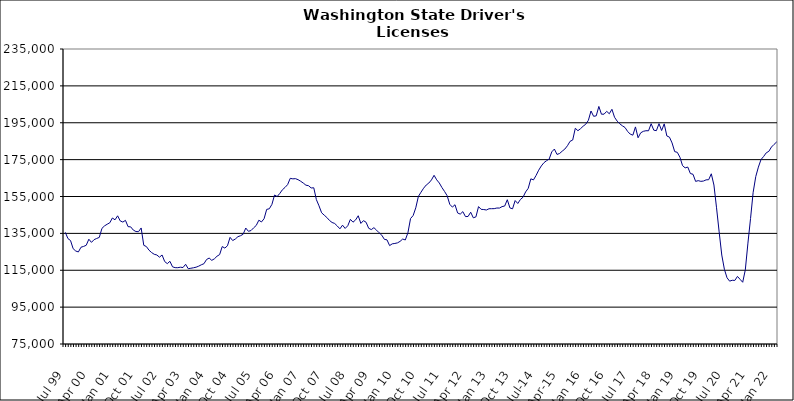
| Category | Series 0 |
|---|---|
| Jul 99 | 135560 |
| Aug 99 | 132182 |
| Sep 99 | 131104 |
| Oct 99 | 126694 |
| Nov 99 | 125425 |
| Dec 99 | 124927 |
| Jan 00 | 127499 |
| Feb 00 | 127927 |
| Mar 00 | 128547 |
| Apr 00 | 131834 |
| May 00 | 130120 |
| Jun 00 | 131595 |
| Jul 00 | 132236 |
| Aug 00 | 132819 |
| Sep 00 | 137711 |
| Oct 00 | 139063 |
| Nov 00 | 139952 |
| Dec 00 | 140732 |
| Jan 01 | 143338 |
| Feb 01 | 142359 |
| Mar 01 | 144523 |
| Apr 01 | 141758 |
| May 01 | 141135 |
| Jun 01 | 142064 |
| Jul 01 | 138646 |
| Aug 01 | 138530 |
| Sep 01 | 136784 |
| Oct 01 | 135996 |
| Nov 01 | 135917 |
| Dec 01 | 137940 |
| Jan 02 | 128531 |
| Feb 02 | 127848 |
| Mar 02 | 125876 |
| Apr 02 | 124595 |
| May 02 | 123660 |
| Jun 02 | 123282 |
| Jul 02 | 122089 |
| Aug 02 | 123279 |
| Sep 02 | 119727 |
| Oct 02 | 118588 |
| Nov 02 | 119854 |
| Dec 02 | 116851 |
| Jan 03 | 116407 |
| Feb 03 | 116382 |
| Mar 03 | 116648 |
| Apr 03 | 116471 |
| May 03 | 118231 |
| Jun 03 | 115831 |
| Jul 03 | 116082 |
| Aug 03 | 116341 |
| Sep 03 | 116653 |
| Oct 03 | 117212 |
| Nov 03 | 117962 |
| Dec 03 | 118542 |
| Jan 04 | 120817 |
| Feb 04 | 121617 |
| Mar 04 | 120369 |
| Apr 04 | 121200 |
| May 04 | 122609 |
| Jun 04 | 123484 |
| Jul 04 | 127844 |
| Aug 04 | 127025 |
| Sep 04 | 128273 |
| Oct 04 | 132853 |
| Nov 04 | 131106 |
| Dec 04 | 131935 |
| Jan 05 | 133205 |
| Feb 05 | 133736 |
| Mar 05 | 134528 |
| Apr 05 | 137889 |
| May 05 | 136130 |
| Jun 05 | 136523 |
| Jul 05 | 137997 |
| Aug 05 | 139294 |
| Sep 05 | 142140 |
| Oct 05 | 141192 |
| Nov 05 | 142937 |
| Dec 05 | 148013 |
| Jan 06 | 148341 |
| Feb 06 | 150744 |
| Mar 06 | 155794 |
| Apr 06 | 154984 |
| May 06 | 156651 |
| Jun 06 | 158638 |
| Jul 06 | 159911 |
| Aug 06 | 161445 |
| Sep 06 | 164852 |
| Oct 06 | 164570 |
| Nov 06 | 164679 |
| Dec 06 | 164127 |
| Jan 07 | 163271 |
| Feb 07 | 162273 |
| Mar 07 | 161140 |
| Apr 07 | 160860 |
| May 07 | 159633 |
| Jun 07 | 159724 |
| Jul 07 | 153303 |
| Aug 07 | 149939 |
| Sep 07 | 146172 |
| Oct 07 | 144876 |
| Nov 07 | 143613 |
| Dec 07 | 142022 |
| Jan 08 | 140909 |
| Feb 08 | 140368 |
| Mar 08 | 138998 |
| Apr 08 | 137471 |
| May 08 | 139453 |
| Jun 08 | 137680 |
| Jul 08 | 139120 |
| Aug 08 | 142612 |
| Sep-08 | 141071 |
| Oct 08 | 142313 |
| Nov 08 | 144556 |
| Dec 08 | 140394 |
| Jan 09 | 141903 |
| Feb 09 | 141036 |
| Mar 09 | 137751 |
| Apr 09 | 137060 |
| May 09 | 138101 |
| Jun 09 | 136739 |
| Jul 09 | 135317 |
| Aug 09 | 134020 |
| Sep 09 | 131756 |
| Oct 09 | 131488 |
| Nov 09 | 128370 |
| Dec 09 | 129323 |
| Jan 10 | 129531 |
| Feb 10 | 129848 |
| Mar 10 | 130654 |
| Apr 10 | 131929 |
| May 10 | 131429 |
| Jun 10 | 135357 |
| Jul 10 | 143032 |
| Aug 10 | 144686 |
| Sep 10 | 148856 |
| Oct 10 | 155042 |
| Nov 10 | 157328 |
| Dec 10 | 159501 |
| Jan 11 | 161221 |
| Feb 11 | 162312 |
| Mar 11 | 163996 |
| Apr 11 | 166495 |
| May 11 | 164040 |
| Jun 11 | 162324 |
| Jul 11 | 159862 |
| Aug 11 | 157738 |
| Sep 11 | 155430 |
| Oct 11 | 150762 |
| Nov 11 | 149255 |
| Dec 11 | 150533 |
| Jan 12 | 146068 |
| Feb 12 | 145446 |
| Mar 12 | 146788 |
| Apr 12 | 144110 |
| May 12 | 144162 |
| Jun 12 | 146482 |
| Jul 12 | 143445 |
| Aug 12 | 143950 |
| Sep 12 | 149520 |
| Oct 12 | 148033 |
| Nov 12 | 147926 |
| Dec 12 | 147674 |
| Jan 13 | 148360 |
| Feb-13 | 148388 |
| Mar-13 | 148414 |
| Apr 13 | 148749 |
| May 13 | 148735 |
| Jun-13 | 149521 |
| Jul 13 | 149837 |
| Aug 13 | 153252 |
| Sep 13 | 148803 |
| Oct 13 | 148315 |
| Nov 13 | 152804 |
| Dec 13 | 151209 |
| Jan 14 | 153357 |
| Feb-14 | 154608 |
| Mar 14 | 157479 |
| Apr 14 | 159441 |
| May 14 | 164591 |
| Jun 14 | 163995 |
| Jul-14 | 166411 |
| Aug-14 | 169272 |
| Sep 14 | 171565 |
| Oct 14 | 173335 |
| Nov 14 | 174406 |
| Dec 14 | 175302 |
| Jan 15 | 179204 |
| Feb 15 | 180737 |
| Mar 15 | 177810 |
| Apr-15 | 178331 |
| May 15 | 179601 |
| Jun-15 | 180729 |
| Jul 15 | 182540 |
| Aug 15 | 184924 |
| Sep 15 | 185620 |
| Oct 15 | 192002 |
| Nov 15 | 190681 |
| Dec 15 | 191795 |
| Jan 16 | 193132 |
| Feb 16 | 194206 |
| Mar 16 | 196319 |
| Apr 16 | 201373 |
| May 16 | 198500 |
| Jun 16 | 198743 |
| Jul 16 | 203841 |
| Aug 16 | 199630 |
| Sep 16 | 199655 |
| Oct 16 | 201181 |
| Nov 16 | 199888 |
| Dec 16 | 202304 |
| Jan 17 | 197977 |
| Feb 17 | 195889 |
| Mar 17 | 194438 |
| Apr 17 | 193335 |
| May 17 | 192430 |
| Jun 17 | 190298 |
| Jul 17 | 188832 |
| Aug 17 | 188264 |
| Sep 17 | 192738 |
| Oct 17 | 186856 |
| Nov 17 | 189537 |
| Dec 17 | 190341 |
| Jan 18 | 190670 |
| Feb 18 | 190645 |
| Mar 18 | 194476 |
| Apr 18 | 190971 |
| May 18 | 190707 |
| Jun 18 | 194516 |
| Jul 18 | 190783 |
| Aug 18 | 194390 |
| Sep 18 | 187831 |
| Oct 18 | 187188 |
| Nov 18 | 184054 |
| Dec 18 | 179347 |
| Jan 19 | 178958 |
| Feb 19 | 176289 |
| Mar 19 | 171747 |
| Apr 19 | 170532 |
| May 19 | 170967 |
| Jun 19 | 167444 |
| Jul 19 | 167059 |
| Aug 19 | 163194 |
| Sep 19 | 163599 |
| Oct 19 | 163212 |
| Nov 19 | 163388 |
| Dec 19 | 164024 |
| Jan 20 | 164114 |
| Feb 20 | 167320 |
| Mar 20 | 161221 |
| Apr 20 | 148866 |
| May 20 | 135821 |
| Jun 20 | 123252 |
| Jul 20 | 115526 |
| Aug 20 | 110940 |
| Sep 20 | 109099 |
| Oct 20 | 109566 |
| Nov 20 | 109488 |
| Dec 20 | 111658 |
| Jan 21 | 110070 |
| Feb 21 | 108491 |
| Mar 21 | 115176 |
| Apr 21 | 129726 |
| May 21 | 143052 |
| Jun 21 | 157253 |
| Jul 21 | 165832 |
| Aug 21 | 170937 |
| Sep 21 | 175042 |
| Oct 21 | 176696 |
| Nov 21 | 178677 |
| Dec 21 | 179501 |
| Jan 22 | 181825 |
| Feb 22 | 183258 |
| Mar 22 | 184618 |